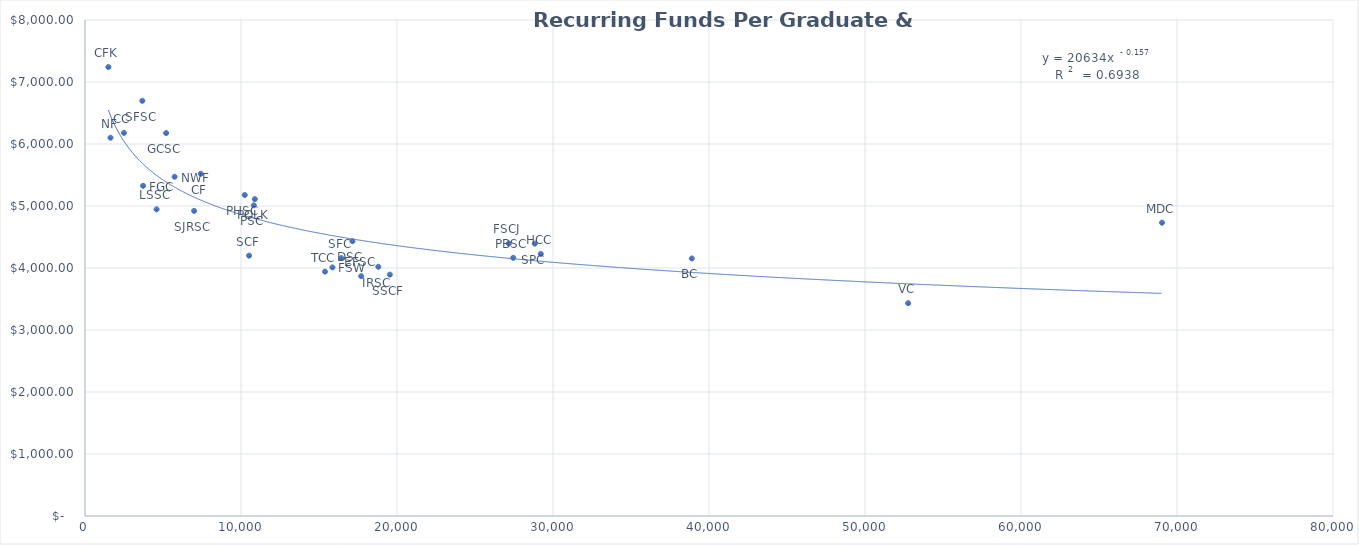
| Category |  Recurring Funds Per Graduate & FTE |
|---|---|
| 1498.1 | 7242.092 |
| 1634.9 | 6101.698 |
| 2498.4 | 6179.012 |
| 3674.9 | 6697.032 |
| 3722.2 | 5325.819 |
| 4589.2 | 4946.771 |
| 5200.0 | 6176.923 |
| 5743.9 | 5472.042 |
| 6992.3 | 4921.324 |
| 7422.1 | 5520.047 |
| 10240.3 | 5177.712 |
| 10517.3 | 4199.667 |
| 10820.3 | 5010.872 |
| 10887.6 | 5111.088 |
| 15385.7 | 3941.767 |
| 15863.5 | 4009.888 |
| 16431.9 | 4159.488 |
| 17144.7 | 4432.573 |
| 17705.3 | 3867.95 |
| 18802.0 | 4020.55 |
| 19540.9 | 3893.185 |
| 27449.1 | 4164.706 |
| 27171.4 | 4395.947 |
| 28829.3 | 4393.196 |
| 29217.5 | 4226.892 |
| 38897.8 | 4154.062 |
| 52766.4 | 3432.702 |
| 69038.8 | 4730.939 |